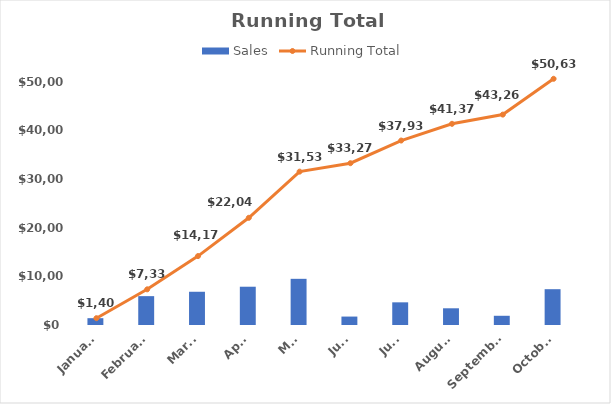
| Category | Sales |
|---|---|
| January | 1402 |
| February | 5935 |
| March | 6835 |
| April | 7871 |
| May | 9496 |
| June | 1734 |
| July | 4662 |
| August | 3437 |
| September | 1896 |
| October | 7364 |